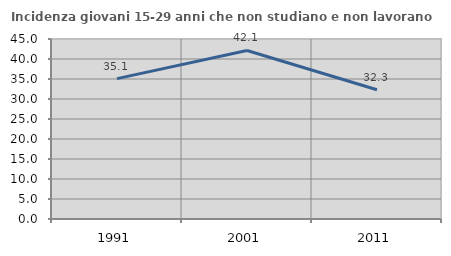
| Category | Incidenza giovani 15-29 anni che non studiano e non lavorano  |
|---|---|
| 1991.0 | 35.101 |
| 2001.0 | 42.128 |
| 2011.0 | 32.306 |